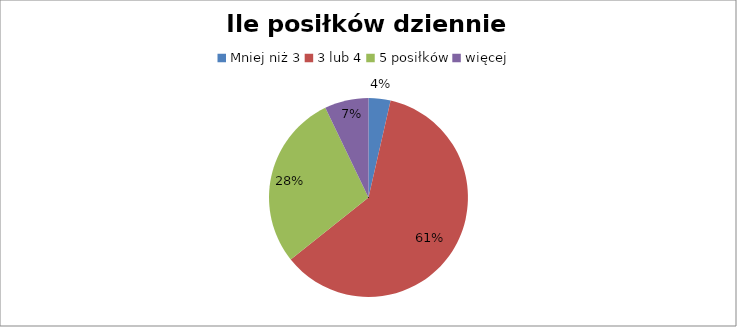
| Category | Ile posiłków dziennie spożywasz? |
|---|---|
| Mniej niż 3 | 1 |
| 3 lub 4 | 17 |
| 5 posiłków | 8 |
| więcej | 2 |